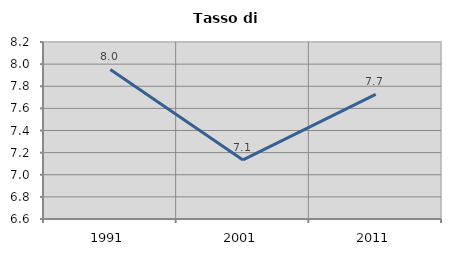
| Category | Tasso di disoccupazione   |
|---|---|
| 1991.0 | 7.952 |
| 2001.0 | 7.134 |
| 2011.0 | 7.727 |